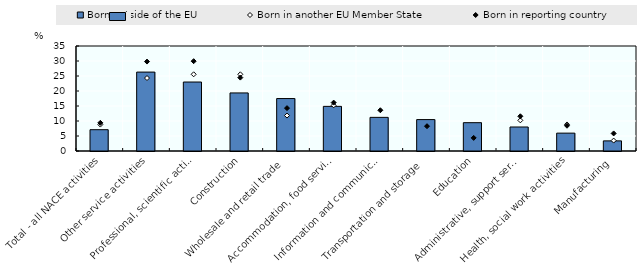
| Category | Born outside of the EU |
|---|---|
| Total - all NACE activities | 7.1 |
| Other service activities | 26.306 |
| Professional, scientific activities | 22.995 |
| Construction | 19.356 |
| Wholesale and retail trade | 17.484 |
| Accommodation, food services | 14.878 |
| Information and communication | 11.209 |
| Transportation and storage | 10.471 |
| Education | 9.443 |
| Administrative, support services | 8.003 |
| Health, social work activities | 5.953 |
| Manufacturing | 3.371 |